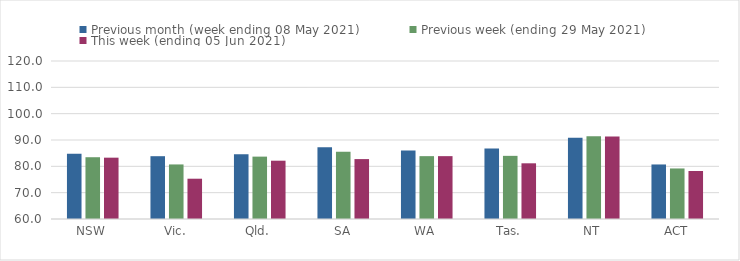
| Category | Previous month (week ending 08 May 2021) | Previous week (ending 29 May 2021) | This week (ending 05 Jun 2021) |
|---|---|---|---|
| NSW | 84.78 | 83.46 | 83.29 |
| Vic. | 83.85 | 80.72 | 75.3 |
| Qld. | 84.55 | 83.69 | 82.14 |
| SA | 87.23 | 85.55 | 82.75 |
| WA | 86 | 83.87 | 83.87 |
| Tas. | 86.73 | 83.98 | 81.15 |
| NT | 90.87 | 91.46 | 91.33 |
| ACT | 80.71 | 79.19 | 78.22 |